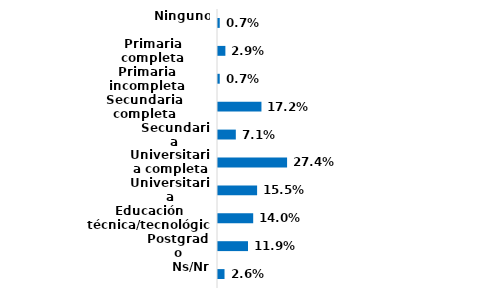
| Category | Series 0 |
|---|---|
| Ninguno | 0.007 |
| Primaria completa | 0.029 |
| Primaria incompleta | 0.007 |
| Secundaria completa | 0.172 |
| Secundaria incompleta | 0.071 |
| Universitaria completa | 0.274 |
| Universitaria incompleta | 0.155 |
| Educación técnica/tecnológica | 0.14 |
| Postgrado | 0.119 |
| Ns/Nr | 0.026 |